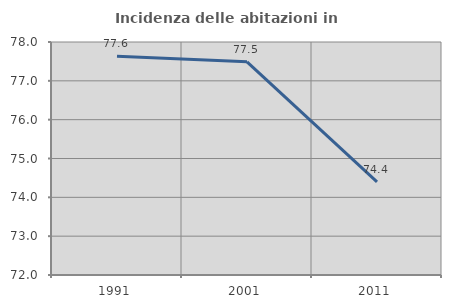
| Category | Incidenza delle abitazioni in proprietà  |
|---|---|
| 1991.0 | 77.634 |
| 2001.0 | 77.49 |
| 2011.0 | 74.398 |